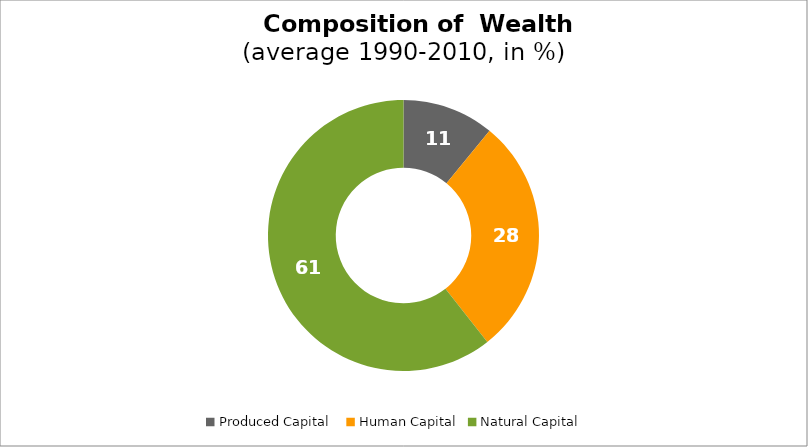
| Category | Series 0 |
|---|---|
| Produced Capital  | 10.947 |
| Human Capital | 28.436 |
| Natural Capital | 60.617 |